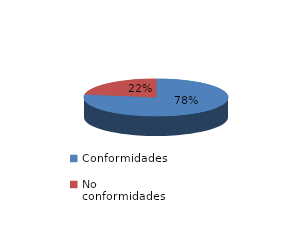
| Category | Series 0 |
|---|---|
| Conformidades | 850 |
| No conformidades | 246 |